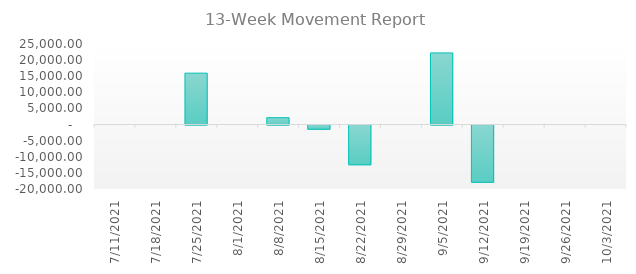
| Category | Value |
|---|---|
| 7/11/21 | 0 |
| 7/18/21 | 0 |
| 7/25/21 | 15948 |
| 8/1/21 | 0 |
| 8/8/21 | 2122 |
| 8/15/21 | -1301 |
| 8/22/21 | -12332 |
| 8/29/21 | 0 |
| 9/5/21 | 22230 |
| 9/12/21 | -17769.155 |
| 9/19/21 | 0 |
| 9/26/21 | 0 |
| 10/3/21 | 0 |